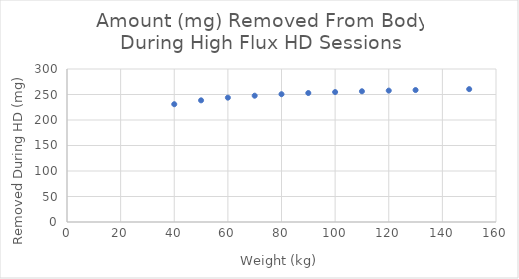
| Category | Series 0 |
|---|---|
| 40.0 | 230.958 |
| 50.0 | 238.546 |
| 60.0 | 243.795 |
| 70.0 | 247.641 |
| 80.0 | 250.58 |
| 90.0 | 252.898 |
| 100.0 | 254.774 |
| 110.0 | 256.322 |
| 120.0 | 257.622 |
| 130.0 | 258.729 |
| 150.0 | 260.514 |